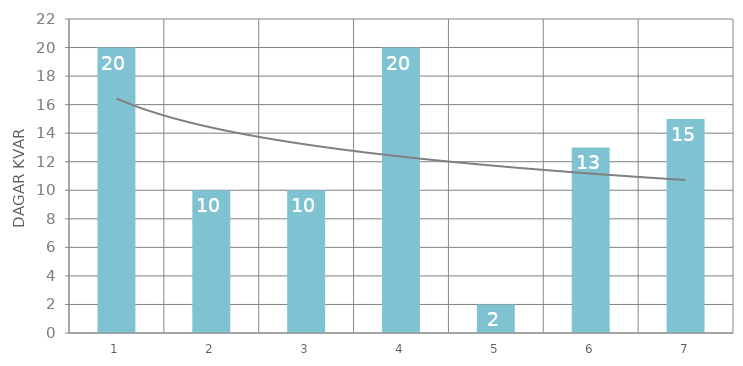
| Category | Summa |
|---|---|
| 1 | 20 |
| 2 | 10 |
| 3 | 10 |
| 4 | 20 |
| 5 | 2 |
| 6 | 13 |
| 7 | 15 |